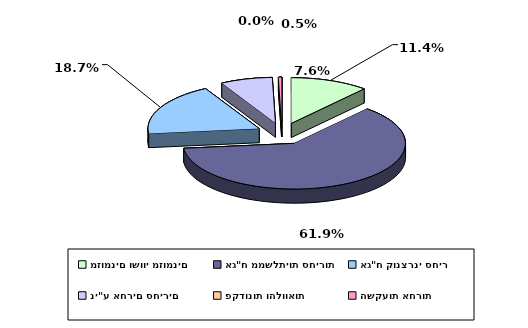
| Category | Series 0 |
|---|---|
| מזומנים ושווי מזומנים | 0.114 |
| אג"ח ממשלתיות סחירות | 0.619 |
| אג"ח קונצרני סחיר | 0.187 |
| ני"ע אחרים סחירים | 0.076 |
| פקדונות והלוואות | 0 |
| השקעות אחרות | 0.005 |